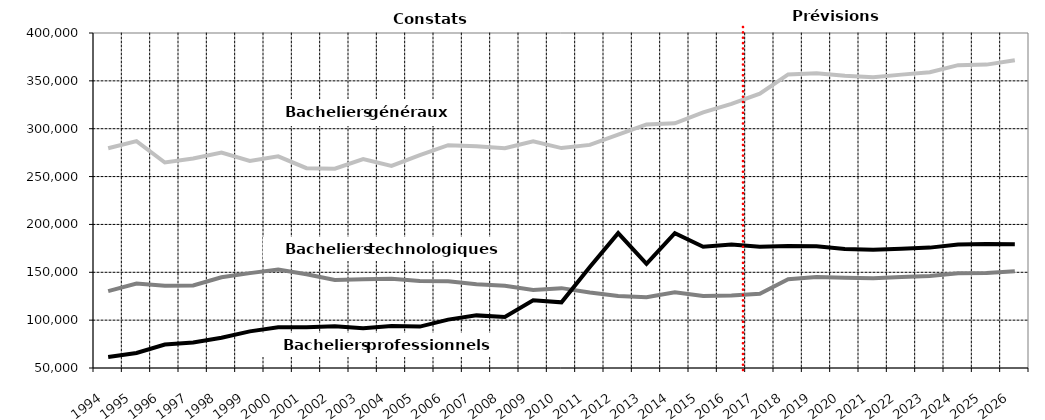
| Category | Bacheliers généraux | Bacheliers technologiques | Bacheliers professionnels |
|---|---|---|---|
| 1994.0 | 279586 | 130282 | 61465 |
| 1995.0 | 287046 | 138267 | 65741 |
| 1996.0 | 264727 | 135882 | 74514 |
| 1997.0 | 268868 | 136204 | 76726 |
| 1998.0 | 275113 | 144830 | 81573 |
| 1999.0 | 266285 | 149103 | 88296 |
| 2000.0 | 271155 | 152778 | 92617 |
| 2001.0 | 258785 | 147944 | 92499 |
| 2002.0 | 258192 | 141983 | 93580 |
| 2003.0 | 268335 | 142799 | 91537 |
| 2004.0 | 261137 | 143277 | 93958 |
| 2005.0 | 272512 | 140828 | 93268 |
| 2006.0 | 282788 | 140707 | 100562 |
| 2007.0 | 281733 | 137605 | 104975 |
| 2008.0 | 279698 | 135886 | 103311 |
| 2009.0 | 286762 | 131602 | 120728 |
| 2010.0 | 279751 | 133431 | 118586 |
| 2011.0 | 283121 | 128832 | 155502 |
| 2012.0 | 293837 | 125121 | 190899 |
| 2013.0 | 304418 | 123986 | 158743 |
| 2014.0 | 305667 | 129210 | 190773 |
| 2015.0 | 317054 | 125144 | 176646 |
| 2016.0 | 325991 | 125768 | 179049 |
| 2017.0 | 336634.83 | 127618.927 | 176785.57 |
| 2018.0 | 356755.245 | 142658.147 | 177451.596 |
| 2019.0 | 358033.606 | 145134.811 | 177288.698 |
| 2020.0 | 355279.863 | 144316.776 | 174426.642 |
| 2021.0 | 353884.168 | 143888.374 | 173604.935 |
| 2022.0 | 356506.899 | 145054.576 | 174658.617 |
| 2023.0 | 359069.14 | 146096.207 | 175769.004 |
| 2024.0 | 366430.555 | 149026.664 | 179022.84 |
| 2025.0 | 366980.413 | 149334.252 | 179610.51 |
| 2026.0 | 371593.545 | 151165.534 | 179394 |